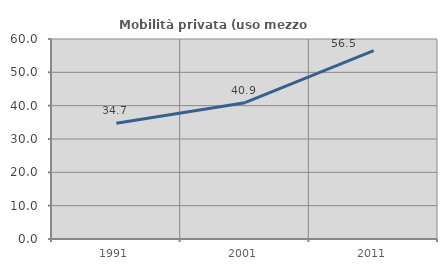
| Category | Mobilità privata (uso mezzo privato) |
|---|---|
| 1991.0 | 34.738 |
| 2001.0 | 40.9 |
| 2011.0 | 56.512 |